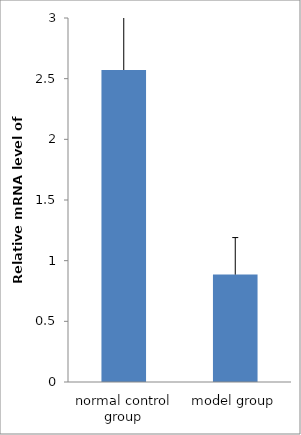
| Category | Series 0 |
|---|---|
| normal control group | 2.571 |
| model group | 0.885 |